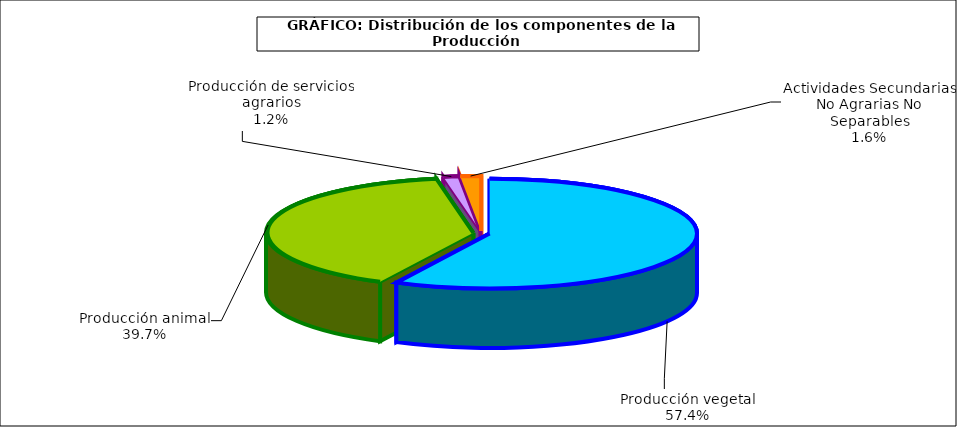
| Category | Producción rama agreria |
|---|---|
| Producción vegetal | 57.424 |
| Producción animal | 39.717 |
| Producción de servicios agrarios | 1.241 |
| Actividades Secundarias No Agrarias No Separables | 1.618 |